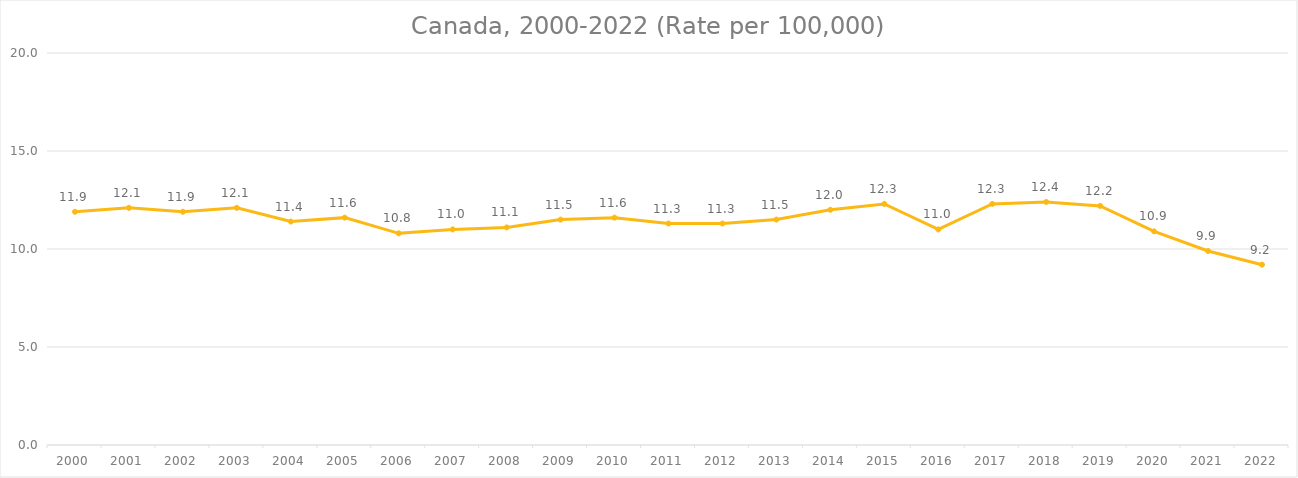
| Category | Series 0 |
|---|---|
| 2000.0 | 11.9 |
| 2001.0 | 12.1 |
| 2002.0 | 11.9 |
| 2003.0 | 12.1 |
| 2004.0 | 11.4 |
| 2005.0 | 11.6 |
| 2006.0 | 10.8 |
| 2007.0 | 11 |
| 2008.0 | 11.1 |
| 2009.0 | 11.5 |
| 2010.0 | 11.6 |
| 2011.0 | 11.3 |
| 2012.0 | 11.3 |
| 2013.0 | 11.5 |
| 2014.0 | 12 |
| 2015.0 | 12.3 |
| 2016.0 | 11 |
| 2017.0 | 12.3 |
| 2018.0 | 12.4 |
| 2019.0 | 12.2 |
| 2020.0 | 10.9 |
| 2021.0 | 9.9 |
| 2022.0 | 9.2 |